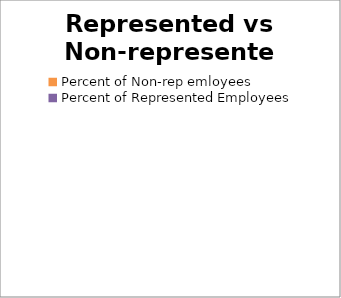
| Category | Series 0 |
|---|---|
| Percent of Non-rep emloyees | 0 |
| Percent of Represented Employees | 0 |